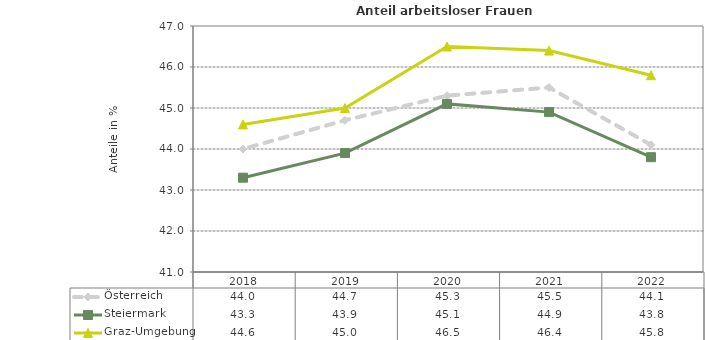
| Category | Österreich | Steiermark | Graz-Umgebung |
|---|---|---|---|
| 2022.0 | 44.1 | 43.8 | 45.8 |
| 2021.0 | 45.5 | 44.9 | 46.4 |
| 2020.0 | 45.3 | 45.1 | 46.5 |
| 2019.0 | 44.7 | 43.9 | 45 |
| 2018.0 | 44 | 43.3 | 44.6 |